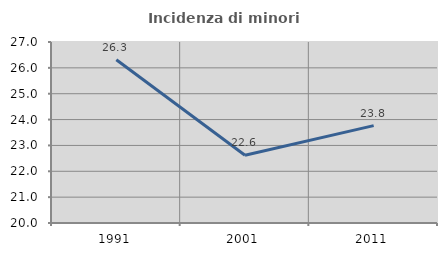
| Category | Incidenza di minori stranieri |
|---|---|
| 1991.0 | 26.316 |
| 2001.0 | 22.619 |
| 2011.0 | 23.765 |